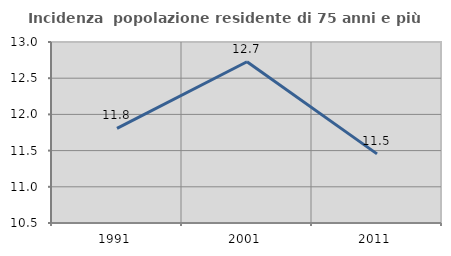
| Category | Incidenza  popolazione residente di 75 anni e più |
|---|---|
| 1991.0 | 11.808 |
| 2001.0 | 12.727 |
| 2011.0 | 11.455 |